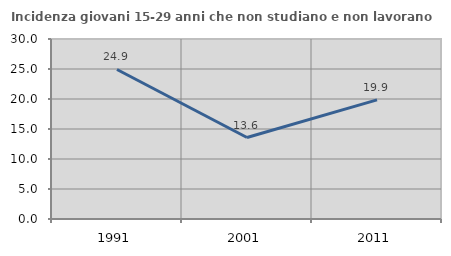
| Category | Incidenza giovani 15-29 anni che non studiano e non lavorano  |
|---|---|
| 1991.0 | 24.918 |
| 2001.0 | 13.576 |
| 2011.0 | 19.863 |